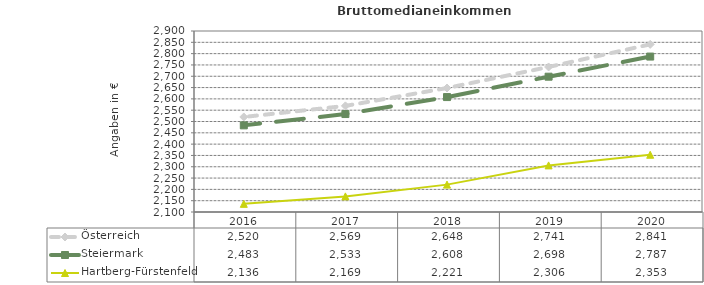
| Category | Österreich | Steiermark | Hartberg-Fürstenfeld |
|---|---|---|---|
| 2020.0 | 2841 | 2787 | 2353 |
| 2019.0 | 2741 | 2698 | 2306 |
| 2018.0 | 2648 | 2608 | 2221 |
| 2017.0 | 2569 | 2533 | 2169 |
| 2016.0 | 2520 | 2483 | 2136 |